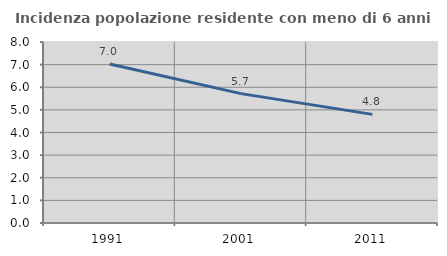
| Category | Incidenza popolazione residente con meno di 6 anni |
|---|---|
| 1991.0 | 7.028 |
| 2001.0 | 5.718 |
| 2011.0 | 4.8 |